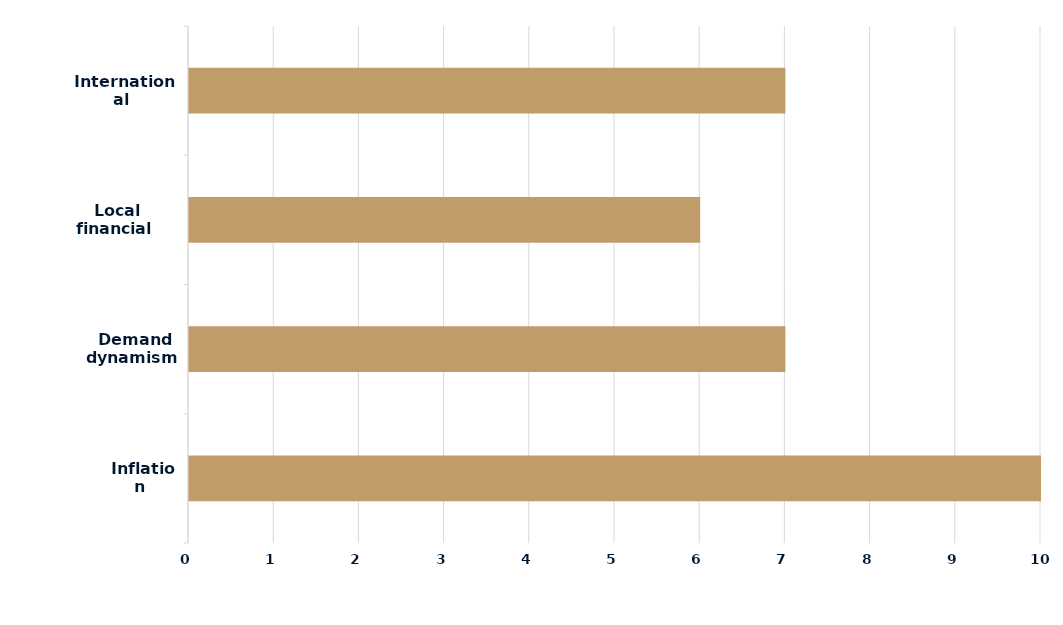
| Category | Series 0 |
|---|---|
|  Inflation | 10 |
|  Demand dynamism | 7 |
|  Local financial conditions | 6 |
|  International environment | 7 |